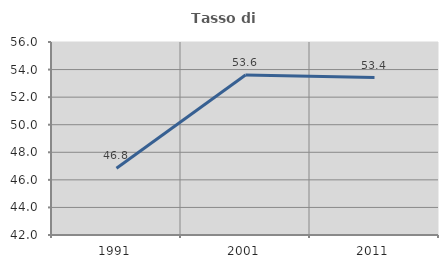
| Category | Tasso di occupazione   |
|---|---|
| 1991.0 | 46.835 |
| 2001.0 | 53.605 |
| 2011.0 | 53.419 |